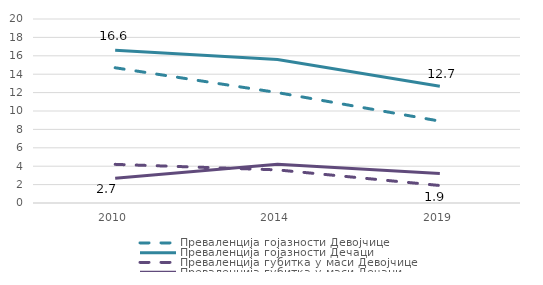
| Category | Преваленција гојазности | Преваленција губитка у маси |
|---|---|---|
| 2010.0 | 16.6 | 2.7 |
| 2014.0 | 15.6 | 4.2 |
| 2019.0 | 12.7 | 3.2 |